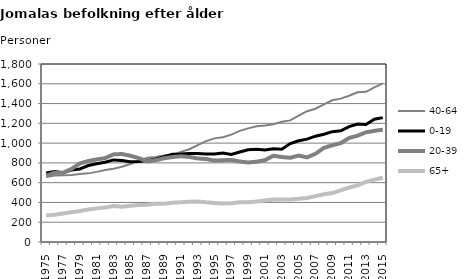
| Category | 40-64 | 0-19 | 20-39 | 65+ |
|---|---|---|---|---|
| 1975.0 | 658 | 697 | 670 | 267 |
| 1976.0 | 673 | 712 | 701 | 275 |
| 1977.0 | 675 | 700 | 700 | 288 |
| 1978.0 | 678 | 727 | 739 | 300 |
| 1979.0 | 688 | 739 | 794 | 313 |
| 1980.0 | 694 | 773 | 819 | 329 |
| 1981.0 | 709 | 792 | 835 | 340 |
| 1982.0 | 727 | 806 | 848 | 349 |
| 1983.0 | 740 | 830 | 886 | 363 |
| 1984.0 | 761 | 823 | 890 | 357 |
| 1985.0 | 788 | 812 | 872 | 367 |
| 1986.0 | 823 | 814 | 848 | 373 |
| 1987.0 | 853 | 824 | 816 | 376 |
| 1988.0 | 860 | 838 | 827 | 387 |
| 1989.0 | 874 | 863 | 847 | 387 |
| 1990.0 | 881 | 888 | 859 | 397 |
| 1991.0 | 911 | 890 | 867 | 401 |
| 1992.0 | 938 | 896 | 860 | 408 |
| 1993.0 | 980 | 894 | 845 | 410 |
| 1994.0 | 1020 | 890 | 839 | 401 |
| 1995.0 | 1048 | 890 | 823 | 395 |
| 1996.0 | 1059 | 900 | 827 | 389 |
| 1997.0 | 1086 | 886 | 830 | 393 |
| 1998.0 | 1124 | 910 | 814 | 402 |
| 1999.0 | 1149 | 933 | 804 | 402 |
| 2000.0 | 1170 | 937 | 812 | 409 |
| 2001.0 | 1179 | 930 | 828 | 419 |
| 2002.0 | 1190 | 942 | 872 | 429 |
| 2003.0 | 1216 | 939 | 859 | 430 |
| 2004.0 | 1230 | 995 | 852 | 431 |
| 2005.0 | 1279 | 1024 | 874 | 437 |
| 2006.0 | 1323 | 1040 | 856 | 445 |
| 2007.0 | 1348 | 1070 | 892 | 464 |
| 2008.0 | 1392 | 1090 | 952 | 483 |
| 2009.0 | 1433 | 1116 | 978 | 495 |
| 2010.0 | 1450 | 1125 | 1000 | 523 |
| 2011.0 | 1479 | 1167 | 1052 | 551 |
| 2012.0 | 1514 | 1193 | 1075 | 573 |
| 2013.0 | 1519 | 1188 | 1109 | 608 |
| 2014.0 | 1564 | 1241 | 1124 | 631 |
| 2015.0 | 1604 | 1258 | 1136 | 650 |